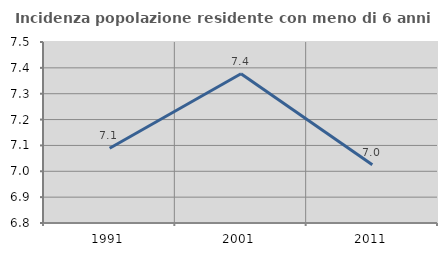
| Category | Incidenza popolazione residente con meno di 6 anni |
|---|---|
| 1991.0 | 7.089 |
| 2001.0 | 7.377 |
| 2011.0 | 7.025 |